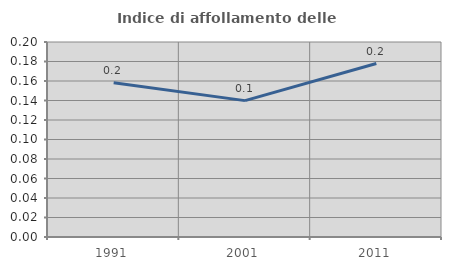
| Category | Indice di affollamento delle abitazioni  |
|---|---|
| 1991.0 | 0.158 |
| 2001.0 | 0.14 |
| 2011.0 | 0.178 |